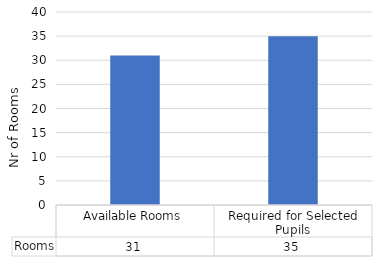
| Category | Rooms |
|---|---|
| Available Rooms | 31 |
| Required for Selected Pupils | 35 |